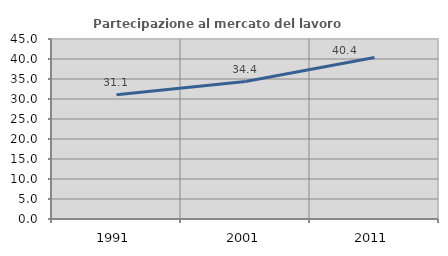
| Category | Partecipazione al mercato del lavoro  femminile |
|---|---|
| 1991.0 | 31.073 |
| 2001.0 | 34.354 |
| 2011.0 | 40.355 |